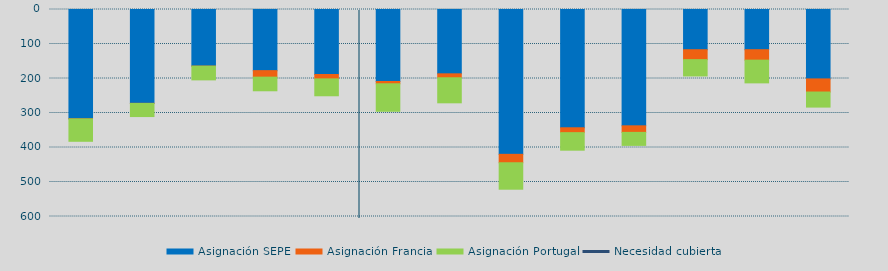
| Category | Asignación SEPE | Asignación Francia | Asignación Portugal |
|---|---|---|---|
| 0 | 316845.45 | 263.2 | 64888 |
| 1 | 271981.65 | 348.4 | 37996.4 |
| 2 | 164113.775 | 130 | 39763.3 |
| 3 | 177218.25 | 18818.7 | 39543.6 |
| 4 | 188386.325 | 12730.4 | 48945.8 |
| 5 | 208745.675 | 6515.6 | 79746.7 |
| 6 | 186451.1 | 11423.2 | 72605.3 |
| 7 | 419821.425 | 24373.9 | 76706.4 |
| 8 | 342830.4 | 14091.1 | 50867.1 |
| 9 | 337163.825 | 19044.4 | 37683.7 |
| 10 | 116549.7 | 28792 | 47265.2 |
| 11 | 116506.5 | 30280 | 65872.4 |
| 12 | 201179.9 | 38015.1 | 43669.5 |